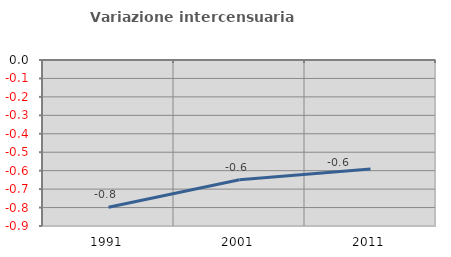
| Category | Variazione intercensuaria annua |
|---|---|
| 1991.0 | -0.798 |
| 2001.0 | -0.65 |
| 2011.0 | -0.591 |